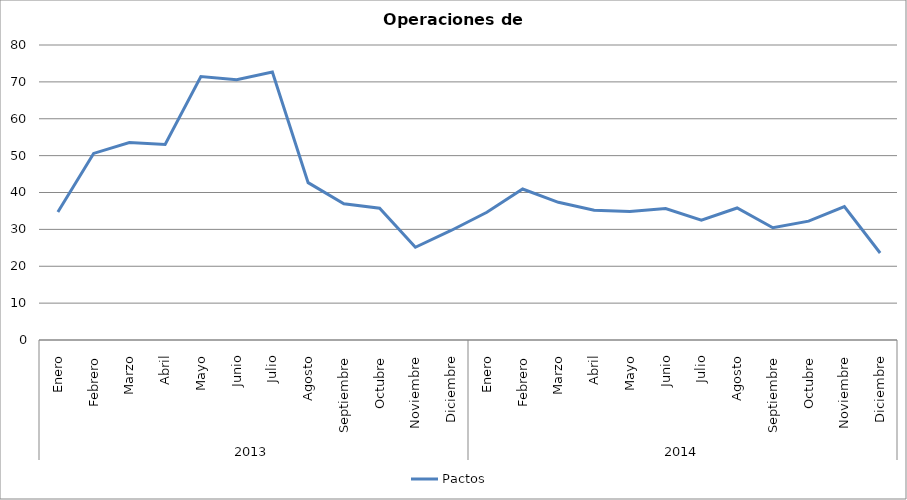
| Category | Pactos |
|---|---|
| 0 | 34.727 |
| 1 | 50.6 |
| 2 | 53.55 |
| 3 | 53 |
| 4 | 71.429 |
| 5 | 70.6 |
| 6 | 72.682 |
| 7 | 42.667 |
| 8 | 36.944 |
| 9 | 35.727 |
| 10 | 25.15 |
| 11 | 29.7 |
| 12 | 34.636 |
| 13 | 40.95 |
| 14 | 37.333 |
| 15 | 35.19 |
| 16 | 34.85 |
| 17 | 35.667 |
| 18 | 32.5 |
| 19 | 35.8 |
| 20 | 30.45 |
| 21 | 32.227 |
| 22 | 36.2 |
| 23 | 23.6 |